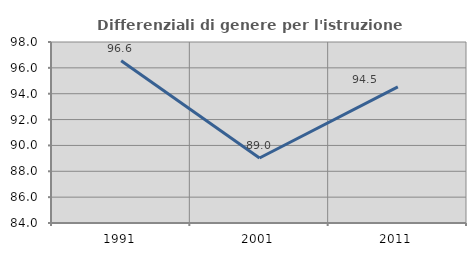
| Category | Differenziali di genere per l'istruzione superiore |
|---|---|
| 1991.0 | 96.553 |
| 2001.0 | 89.03 |
| 2011.0 | 94.529 |